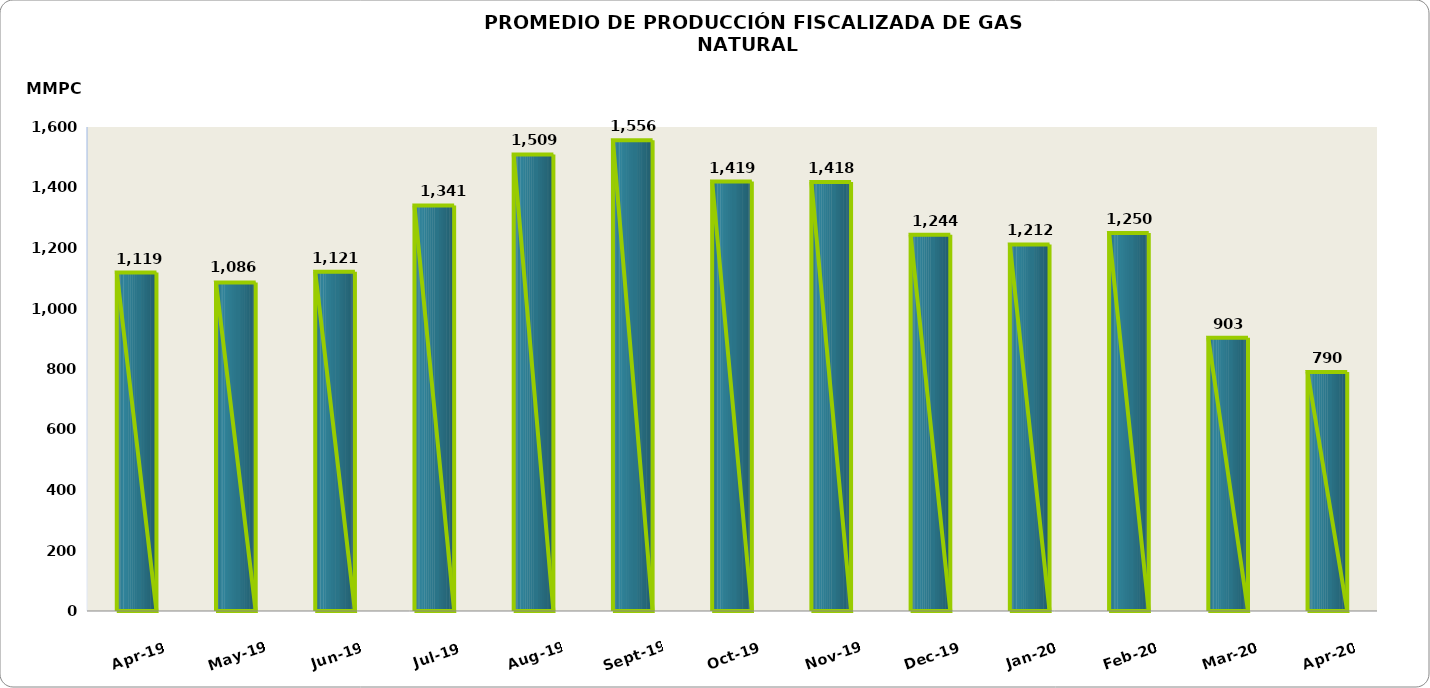
| Category | Series 0 |
|---|---|
| 2019-04-01 | 1119085.77 |
| 2019-05-01 | 1085771.407 |
| 2019-06-01 | 1121340.831 |
| 2019-07-01 | 1340583.234 |
| 2019-08-01 | 1509143.818 |
| 2019-09-01 | 1555961 |
| 2019-10-01 | 1419451.631 |
| 2019-11-01 | 1418369.941 |
| 2019-12-01 | 1243898.965 |
| 2020-01-01 | 1211720.692 |
| 2020-02-01 | 1249771.288 |
| 2020-03-01 | 903310.04 |
| 2020-04-01 | 790178.83 |